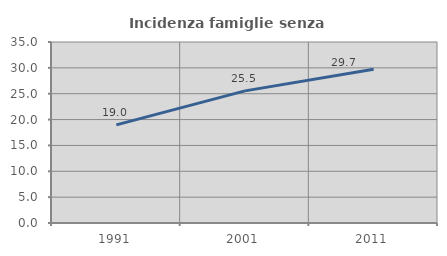
| Category | Incidenza famiglie senza nuclei |
|---|---|
| 1991.0 | 18.968 |
| 2001.0 | 25.548 |
| 2011.0 | 29.713 |